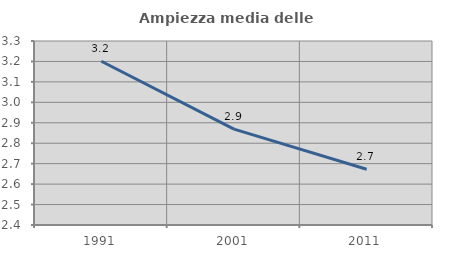
| Category | Ampiezza media delle famiglie |
|---|---|
| 1991.0 | 3.201 |
| 2001.0 | 2.869 |
| 2011.0 | 2.673 |